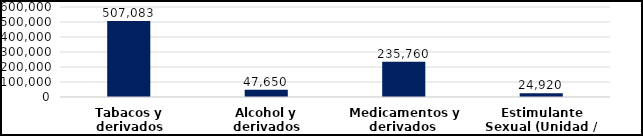
| Category | Series 0 |
|---|---|
| Tabacos y derivados (Unidad) | 507083 |
| Alcohol y derivados (Botellas) | 47650 |
| Medicamentos y derivados  (Unidad) | 235760 |
| Estimulante Sexual (Unidad / Frasco) | 24920 |